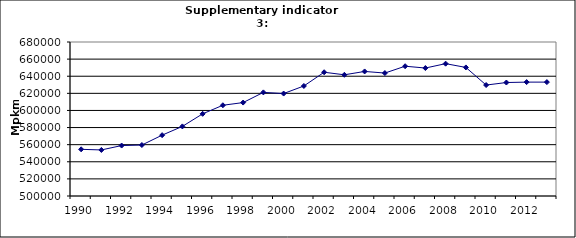
| Category | Passenger transport by cars, Mpkm |
|---|---|
| 1990 | 554558.563 |
| 1991 | 553827.624 |
| 1992 | 558956.885 |
| 1993 | 559590.121 |
| 1994 | 571131.959 |
| 1995 | 581345.784 |
| 1996 | 596040.657 |
| 1997 | 606059.18 |
| 1998 | 609205.437 |
| 1999 | 621108.391 |
| 2000 | 619748.526 |
| 2001 | 628601.72 |
| 2002 | 644652.801 |
| 2003 | 641662.337 |
| 2004 | 645581.472 |
| 2005 | 643697.02 |
| 2006 | 651707.286 |
| 2007 | 649572.899 |
| 2008 | 654685.466 |
| 2009 | 650273.5 |
| 2010 | 629681.113 |
| 2011 | 632638.689 |
| 2012 | 633112.143 |
| 2013 | 633112.324 |